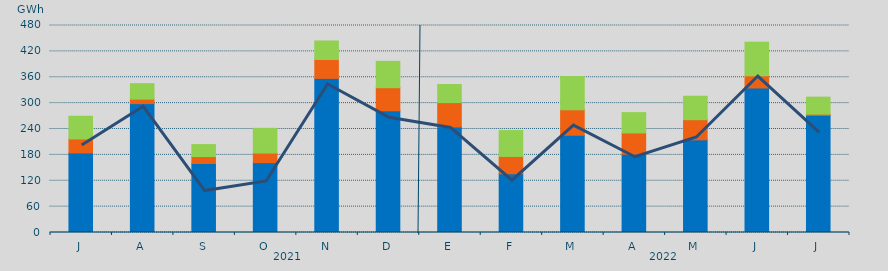
| Category | Asignación SEPE | Asignación Francia | Asignación Portugal |
|---|---|---|---|
| J | 184550.8 | 32356.7 | 52628.6 |
| A | 298829.9 | 10422.8 | 35868.4 |
| S | 160066 | 16160 | 27614.8 |
| O | 161949.6 | 22251.7 | 57303 |
| N | 357339.7 | 43842.5 | 42886.3 |
| D | 282259.4 | 53460 | 61129.1 |
| E | 244787.3 | 56434 | 41874.5 |
| F | 136191.8 | 40226.7 | 59973 |
| M | 225622.7 | 58889.7 | 77145.2 |
| A | 181585.4 | 49218 | 47192.7 |
| M | 214905.3 | 46679.2 | 54371.7 |
| J | 335176.8 | 28179 | 77960.7 |
| J | 271567.05 | 2839.1 | 39441.4 |